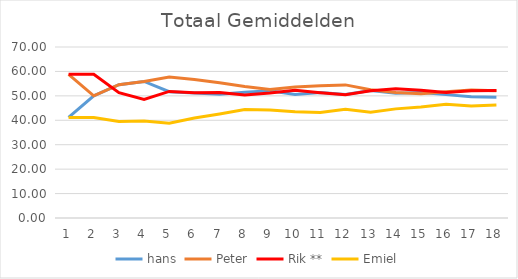
| Category | hans | Peter | Rik **  | Emiel |
|---|---|---|---|---|
| 0 | 41.17 | 58.83 | 58.83 | 41.17 |
| 1 | 50 | 50 | 58.83 | 41.17 |
| 2 | 54.583 | 54.583 | 51.303 | 39.53 |
| 3 | 55.895 | 55.895 | 48.52 | 39.69 |
| 4 | 51.716 | 57.716 | 51.816 | 38.752 |
| 5 | 51.152 | 56.708 | 51.235 | 40.905 |
| 6 | 50.63 | 55.393 | 51.416 | 42.561 |
| 7 | 51.436 | 53.834 | 50.354 | 44.376 |
| 8 | 52.101 | 52.583 | 51.139 | 44.177 |
| 9 | 50.599 | 53.617 | 52.317 | 43.467 |
| 10 | 51.378 | 54.122 | 51.273 | 43.227 |
| 11 | 50.548 | 54.493 | 50.452 | 44.507 |
| 12 | 52.179 | 52.475 | 52.09 | 43.256 |
| 13 | 51.089 | 51.364 | 52.875 | 44.672 |
| 14 | 51.411 | 50.878 | 52.289 | 45.422 |
| 15 | 50.506 | 51.641 | 51.328 | 46.526 |
| 16 | 49.604 | 52.416 | 52.122 | 45.858 |
| 17 | 49.408 | 52.064 | 52.222 | 46.306 |